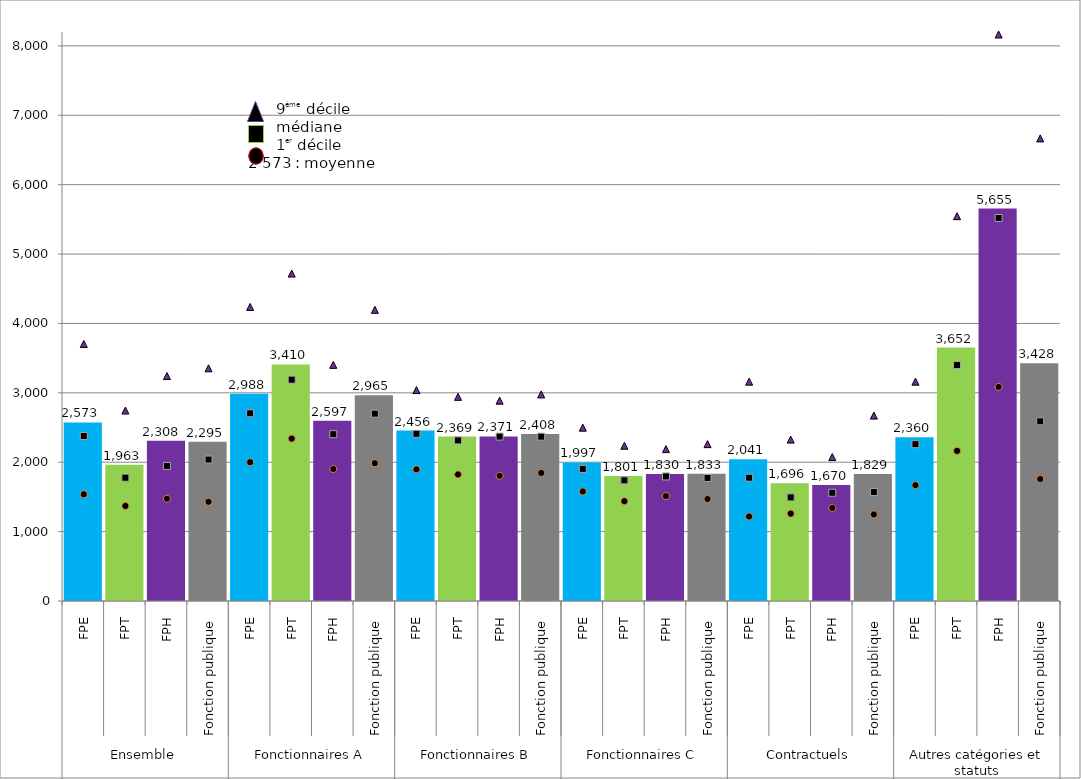
| Category | Moy |
|---|---|
| 0 | 2573 |
| 1 | 1963 |
| 2 | 2308 |
| 3 | 2295.16 |
| 4 | 2988 |
| 5 | 3410 |
| 6 | 2597 |
| 7 | 2965.41 |
| 8 | 2456 |
| 9 | 2369 |
| 10 | 2371 |
| 11 | 2408.02 |
| 12 | 1997 |
| 13 | 1801 |
| 14 | 1830 |
| 15 | 1833.28 |
| 16 | 2041 |
| 17 | 1696 |
| 18 | 1670 |
| 19 | 1828.92 |
| 20 | 2360 |
| 21 | 3652 |
| 22 | 5655 |
| 23 | 3427.63 |